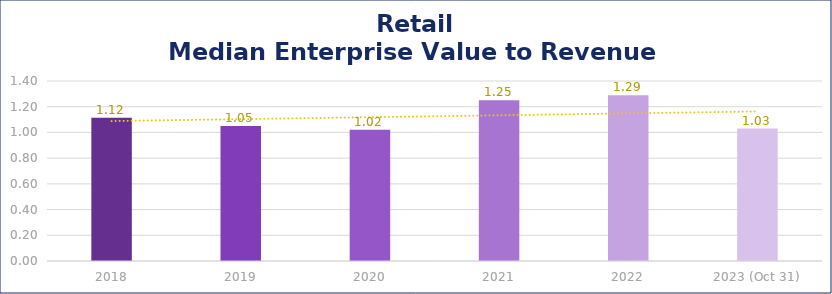
| Category | Retail |
|---|---|
| 2018 | 1.115 |
| 2019 | 1.05 |
| 2020 | 1.02 |
| 2021 | 1.25 |
| 2022 | 1.29 |
| 2023 (Oct 31) | 1.03 |